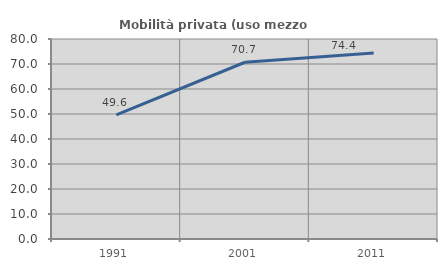
| Category | Mobilità privata (uso mezzo privato) |
|---|---|
| 1991.0 | 49.618 |
| 2001.0 | 70.701 |
| 2011.0 | 74.419 |